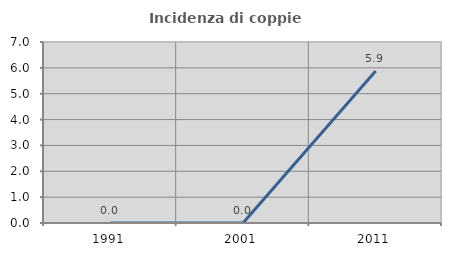
| Category | Incidenza di coppie miste |
|---|---|
| 1991.0 | 0 |
| 2001.0 | 0 |
| 2011.0 | 5.882 |